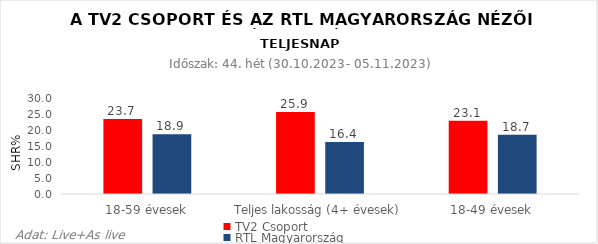
| Category | TV2 Csoport | RTL Magyarország |
|---|---|---|
| 18-59 évesek | 23.7 | 18.9 |
| Teljes lakosság (4+ évesek) | 25.9 | 16.4 |
| 18-49 évesek | 23.1 | 18.7 |